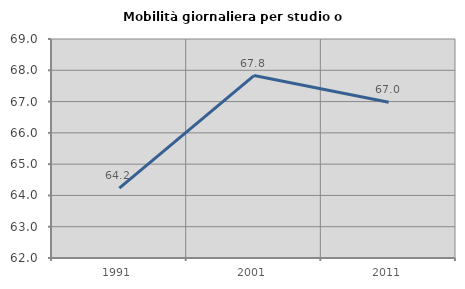
| Category | Mobilità giornaliera per studio o lavoro |
|---|---|
| 1991.0 | 64.231 |
| 2001.0 | 67.832 |
| 2011.0 | 66.98 |